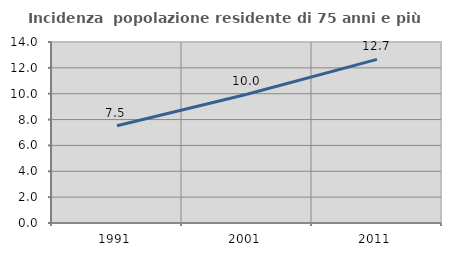
| Category | Incidenza  popolazione residente di 75 anni e più |
|---|---|
| 1991.0 | 7.516 |
| 2001.0 | 9.963 |
| 2011.0 | 12.658 |